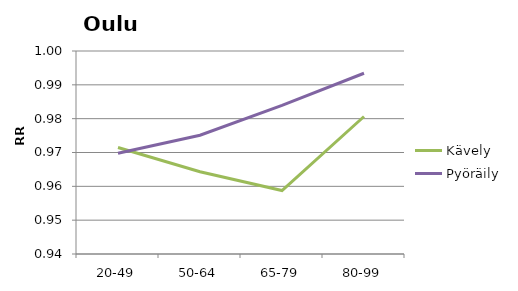
| Category | Kävely | Pyöräily |
|---|---|---|
| 20-49 | 0.971 | 0.97 |
| 50-64 | 0.964 | 0.975 |
| 65-79 | 0.959 | 0.984 |
| 80-99 | 0.981 | 0.993 |